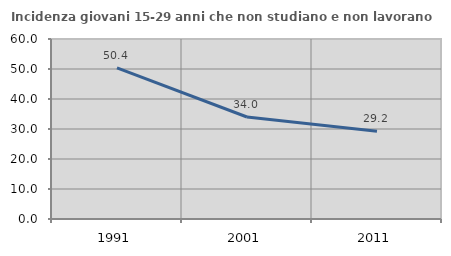
| Category | Incidenza giovani 15-29 anni che non studiano e non lavorano  |
|---|---|
| 1991.0 | 50.379 |
| 2001.0 | 34.009 |
| 2011.0 | 29.234 |